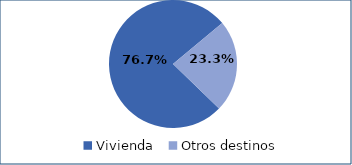
| Category | Series 0 |
|---|---|
| Vivienda | 0.767 |
| Otros destinos | 0.233 |